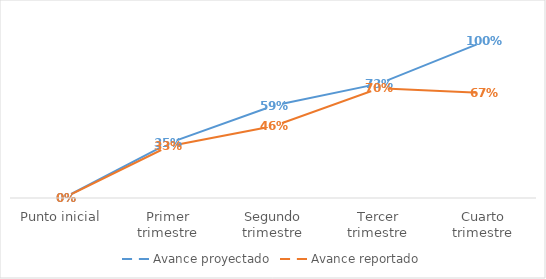
| Category | Avance proyectado | Avance reportado |
|---|---|---|
| Punto inicial | 0 | 0 |
| Primer trimestre | 0.35 | 0.33 |
| Segundo trimestre | 0.59 | 0.46 |
| Tercer trimestre | 0.73 | 0.7 |
| Cuarto trimestre | 1 | 0.67 |